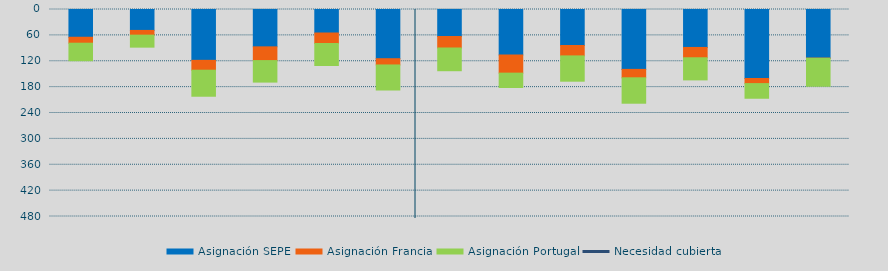
| Category | Asignación SEPE | Asignación Francia | Asignación Portugal |
|---|---|---|---|
| 0 | 64347.4 | 13794.4 | 40614.3 |
| 1 | 48510.6 | 10931.6 | 27867.9 |
| 2 | 117881.4 | 22871.5 | 60380.5 |
| 3 | 86621.2 | 31842.2 | 49868.6 |
| 4 | 54505.3 | 24354.5 | 51005.7 |
| 5 | 114103.8 | 14504.8 | 58082.9 |
| 6 | 62612.7 | 26635.4 | 52718.7 |
| 7 | 105519.2 | 42049.8 | 33318.5 |
| 8 | 83466.2 | 24132.5 | 58650.9 |
| 9 | 138850.6 | 19527.1 | 58931.4 |
| 10 | 88000.9 | 23926.8 | 51284.5 |
| 11 | 159946.5 | 11873.6 | 33973.4 |
| 12 | 112774.35 | 263.2 | 64888 |